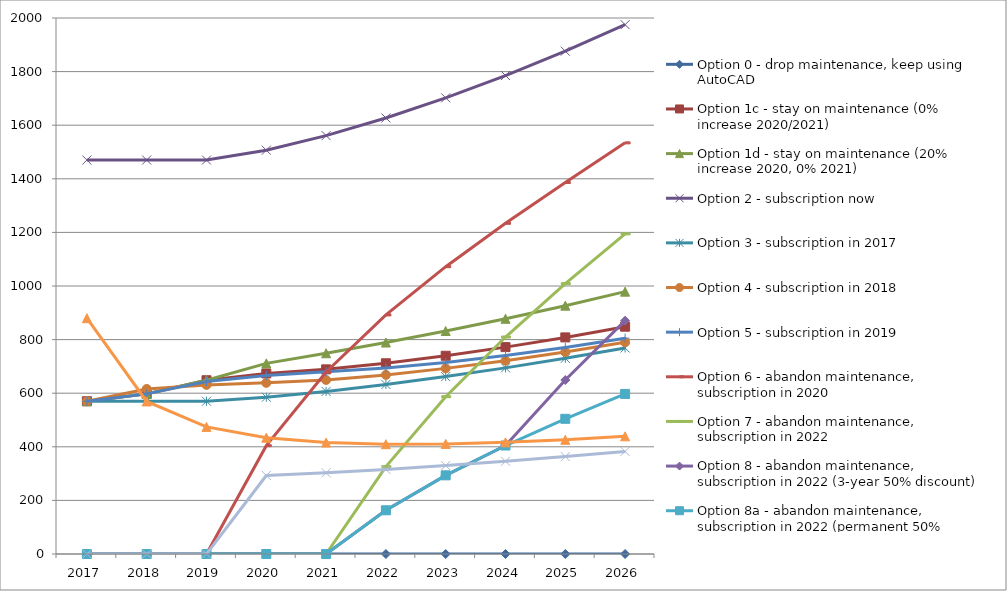
| Category | Option 0 - drop maintenance, keep using AutoCAD | Option 1c - stay on maintenance (0% increase 2020/2021) | Option 1d - stay on maintenance (20% increase 2020, 0% 2021) | Option 2 - subscription now | Option 3 - subscription in 2017 | Option 4 - subscription in 2018 | Option 5 - subscription in 2019 | Option 6 - abandon maintenance, subscription in 2020 | Option 7 - abandon maintenance, subscription in 2022 | Option 8 - abandon maintenance, subscription in 2022 (3-year 50% discount) | Option 8a - abandon maintenance, subscription in 2022 (permanent 50% discount) | Option 9 - BricsCAD Pro with maintenance | Option 10 - BricsCAD Pro with maintenance in 2020 |
|---|---|---|---|---|---|---|---|---|---|---|---|---|---|
| 2017.0 | 0 | 570 | 570 | 1470 | 570 | 570 | 570 | 0 | 0 | 0 | 0 | 880 | 0 |
| 2018.0 | 0 | 597.5 | 597.5 | 1470 | 570 | 615.75 | 597.5 | 0 | 0 | 0 | 0 | 569.25 | 0 |
| 2019.0 | 0 | 648.333 | 648.333 | 1470 | 570 | 631 | 643.333 | 0 | 0 | 0 | 0 | 474.283 | 0 |
| 2020.0 | 0 | 673.75 | 711.25 | 1506.75 | 585 | 638.625 | 666.25 | 404.25 | 0 | 0 | 0 | 433.909 | 292.82 |
| 2021.0 | 0 | 689 | 749 | 1561.14 | 606.6 | 649.5 | 680 | 679.14 | 0 | 0 | 0 | 415.94 | 303.069 |
| 2022.0 | 0 | 711.667 | 789.167 | 1627.045 | 632.55 | 668.3 | 693.717 | 892.045 | 326.095 | 163.048 | 163.048 | 409.695 | 315.636 |
| 2023.0 | 0 | 739.643 | 832 | 1702.071 | 661.976 | 692.619 | 714.404 | 1072.071 | 586.971 | 293.486 | 293.486 | 410.641 | 330.019 |
| 2024.0 | 0 | 771.969 | 877.738 | 1785.243 | 694.527 | 721.339 | 740.402 | 1233.993 | 809.531 | 404.765 | 404.765 | 416.554 | 346.01 |
| 2025.0 | 0 | 808.203 | 926.621 | 1876.238 | 730.093 | 753.926 | 770.87 | 1386.238 | 1008.938 | 649.146 | 504.469 | 426.242 | 363.536 |
| 2026.0 | 0 | 848.171 | 978.905 | 1975.076 | 768.692 | 790.142 | 805.392 | 1534.076 | 1194.506 | 870.693 | 597.253 | 439.029 | 382.594 |